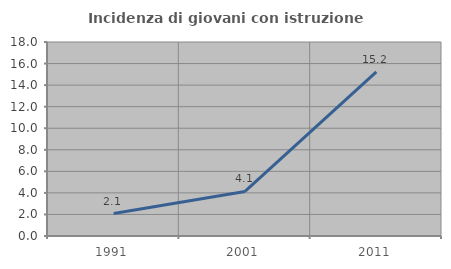
| Category | Incidenza di giovani con istruzione universitaria |
|---|---|
| 1991.0 | 2.083 |
| 2001.0 | 4.132 |
| 2011.0 | 15.238 |